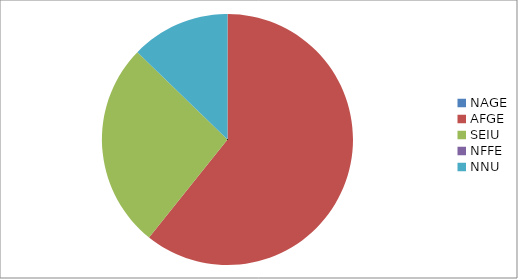
| Category | Series 0 |
|---|---|
| NAGE | 0 |
| AFGE | 7020 |
| SEIU | 3063 |
| NFFE | 0 |
| NNU | 1473 |